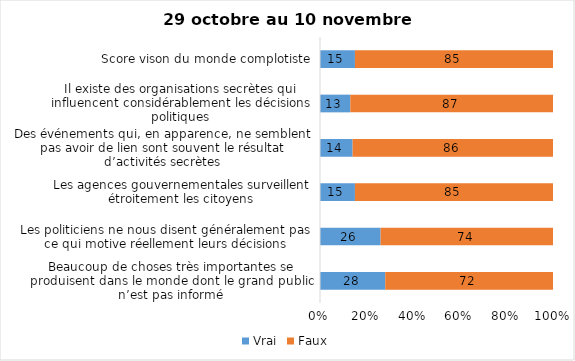
| Category | Vrai | Faux |
|---|---|---|
| Beaucoup de choses très importantes se produisent dans le monde dont le grand public n’est pas informé | 28 | 72 |
| Les politiciens ne nous disent généralement pas ce qui motive réellement leurs décisions | 26 | 74 |
| Les agences gouvernementales surveillent étroitement les citoyens | 15 | 85 |
| Des événements qui, en apparence, ne semblent pas avoir de lien sont souvent le résultat d’activités secrètes | 14 | 86 |
| Il existe des organisations secrètes qui influencent considérablement les décisions politiques | 13 | 87 |
| Score vison du monde complotiste | 15 | 85 |